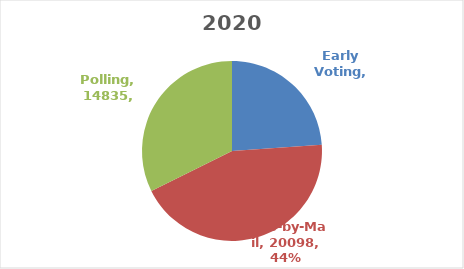
| Category | Series 0 |
|---|---|
| Early Voting | 10975 |
| Vote-by-Mail | 20098 |
| Polling | 14835 |